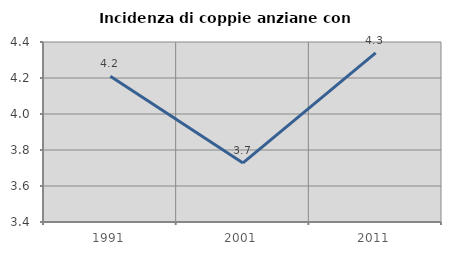
| Category | Incidenza di coppie anziane con figli |
|---|---|
| 1991.0 | 4.209 |
| 2001.0 | 3.728 |
| 2011.0 | 4.34 |